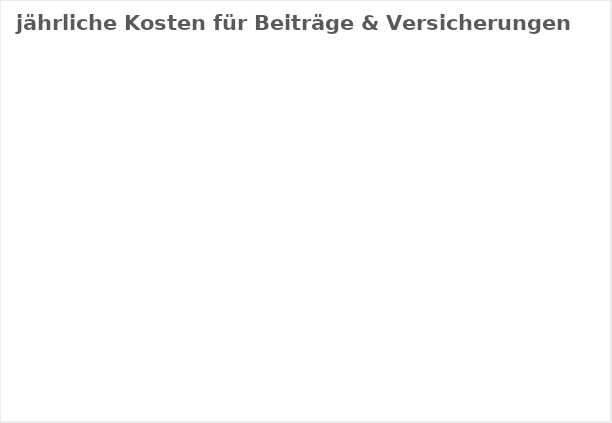
| Category | Betrag |
|---|---|
| 0.0 | 0 |
| 0.0 | 0 |
| 0.0 | 0 |
| 0.0 | 0 |
| 0.0 | 0 |
| 0.0 | 0 |
| 0.0 | 0 |
| 0.0 | 0 |
| 0.0 | 0 |
| 0.0 | 0 |
| 0.0 | 0 |
| 0.0 | 0 |
| 0.0 | 0 |
| 0.0 | 0 |
| 0.0 | 0 |